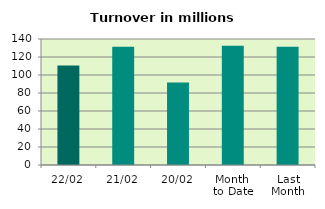
| Category | Series 0 |
|---|---|
| 22/02 | 110.448 |
| 21/02 | 131.337 |
| 20/02 | 91.571 |
| Month 
to Date | 132.538 |
| Last
Month | 131.402 |